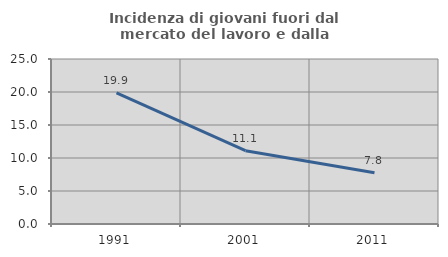
| Category | Incidenza di giovani fuori dal mercato del lavoro e dalla formazione  |
|---|---|
| 1991.0 | 19.853 |
| 2001.0 | 11.111 |
| 2011.0 | 7.778 |